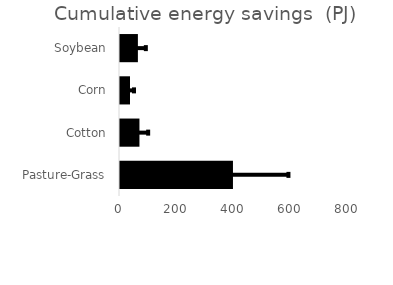
| Category | Cumulative energy savings  (PJ) |
|---|---|
| Pasture-Grass | 394.622 |
| Cotton | 67.924 |
| Corn | 34.936 |
| Soybean | 62.488 |